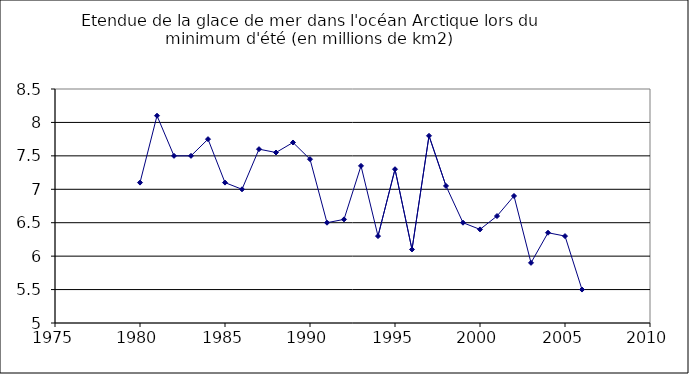
| Category | Series 0 |
|---|---|
| 1980.0 | 7.1 |
| 1981.0 | 8.1 |
| 1982.0 | 7.5 |
| 1983.0 | 7.5 |
| 1984.0 | 7.75 |
| 1985.0 | 7.1 |
| 1986.0 | 7 |
| 1987.0 | 7.6 |
| 1988.0 | 7.55 |
| 1989.0 | 7.7 |
| 1990.0 | 7.45 |
| 1991.0 | 6.5 |
| 1992.0 | 6.55 |
| 1993.0 | 7.35 |
| 1994.0 | 6.3 |
| 1995.0 | 7.3 |
| 1996.0 | 6.1 |
| 1997.0 | 7.8 |
| 1998.0 | 7.05 |
| 1999.0 | 6.5 |
| 2000.0 | 6.4 |
| 2001.0 | 6.6 |
| 2002.0 | 6.9 |
| 2003.0 | 5.9 |
| 2004.0 | 6.35 |
| 2005.0 | 6.3 |
| 2006.0 | 5.5 |